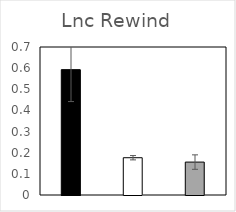
| Category | Lnc023 |
|---|---|
| Scr+Ctr | 0.593 |
| KD023 | 0.176 |
| KD023+ siWnt7b | 0.156 |